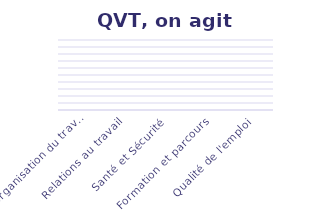
| Category | On agit |
|---|---|
| Organisation du travail | 0 |
| Relations au travail | 0 |
| Santé et Sécurité | 0 |
| Formation et parcours | 0 |
| Qualité de l'emploi | 0 |